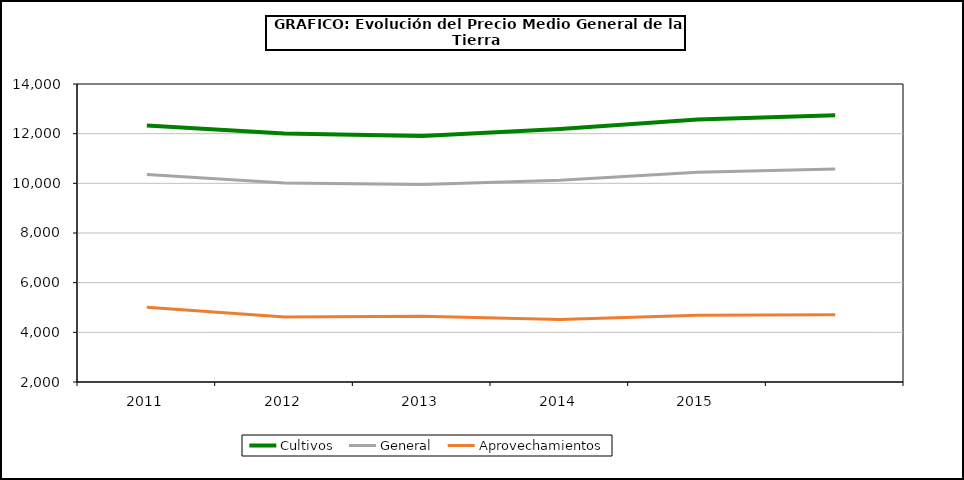
| Category | Cultivos | General | Aprovechamientos |
|---|---|---|---|
| 0 | 12325 | 10357.792 | 5014.285 |
| 1 | 12005.431 | 10016.851 | 4615.238 |
| 2 | 11910.019 | 9954.811 | 4643.846 |
| 3 | 12192.232 | 10126.573 | 4515.587 |
| 4 | 12574.317 | 10451.228 | 4684.247 |
| 5 | 12744 | 10582 | 4709 |